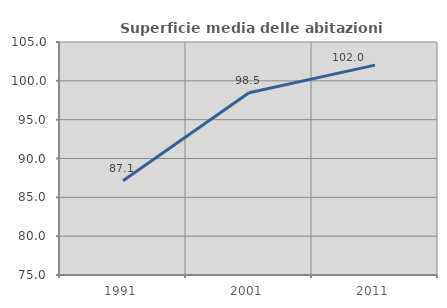
| Category | Superficie media delle abitazioni occupate |
|---|---|
| 1991.0 | 87.135 |
| 2001.0 | 98.46 |
| 2011.0 | 102.027 |